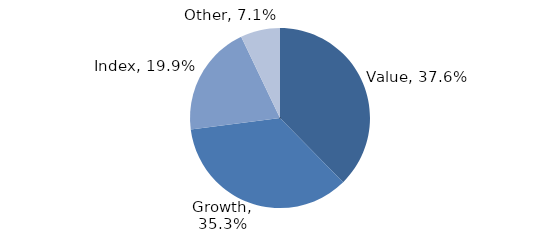
| Category | Investment Style |
|---|---|
| Value | 0.376 |
| Growth | 0.353 |
| Index | 0.199 |
| Other | 0.071 |